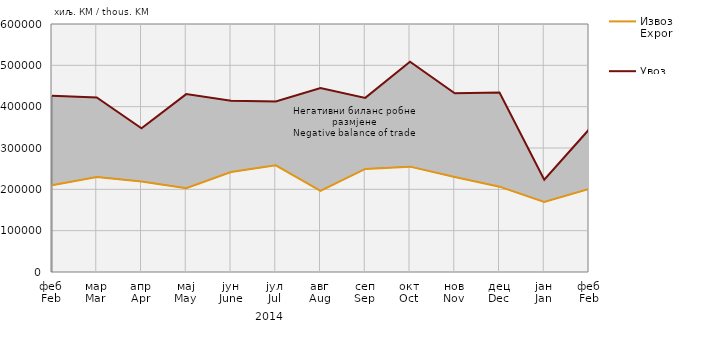
| Category | Извоз
Export | Увоз
Import |
|---|---|---|
| феб
Feb | 209705 | 426242 |
| мар
Mar | 229938 | 422057 |
| апр
Apr | 218972 | 347841 |
| мај
May | 202886 | 430360 |
| јун
June | 241773 | 414297 |
| јул
Jul | 258199 | 412801 |
| авг
Aug | 196460 | 444841 |
| сеп
Sep | 249428 | 421218 |
| окт
Oct | 254890 | 508654 |
| нов
Nov | 229750 | 432236 |
| дец
Dec | 206445 | 434262 |
| јан
Jan | 169512 | 223470 |
| феб
Feb | 200956 | 344743 |